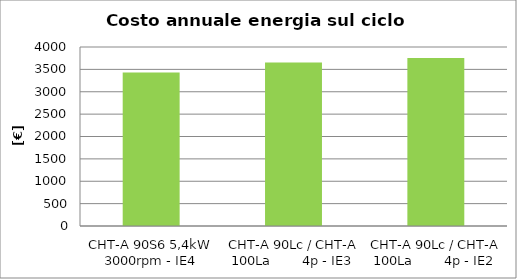
| Category | Series 1 |
|---|---|
| CHT-A 90S6 5,4kW 3000rpm - IE4 | 3432 |
| CHT-A 90Lc / CHT-A 100La        4p - IE3 | 3654 |
| CHT-A 90Lc / CHT-A 100La        4p - IE2 | 3756 |